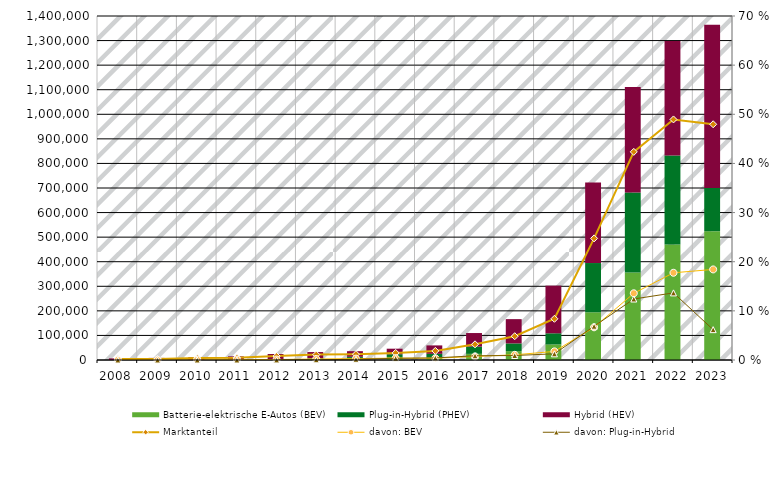
| Category | Batterie-elektrische E-Autos (BEV) | Plug-in-Hybrid (PHEV) | Hybrid (HEV) |
|---|---|---|---|
| 2008.0 | 36 | 0 | 6464 |
| 2009.0 | 162 | 0 | 8374 |
| 2010.0 | 541 | 0 | 10661 |
| 2011.0 | 2154 | 0 | 12622 |
| 2012.0 | 2956 | 408 | 21030 |
| 2013.0 | 6051 | 1385 | 24963 |
| 2014.0 | 8522 | 4527 | 22908 |
| 2015.0 | 12363 | 11101 | 22529 |
| 2016.0 | 11410 | 13744 | 34252 |
| 2017.0 | 25056 | 29436 | 55239 |
| 2018.0 | 36062 | 31442 | 98816 |
| 2019.0 | 63281 | 45348 | 193902 |
| 2020.0 | 194163 | 200469 | 327395 |
| 2021.0 | 355961 | 325449 | 429139 |
| 2022.0 | 470559 | 362093 | 465228 |
| 2023.0 | 524219 | 175724 | 664580 |